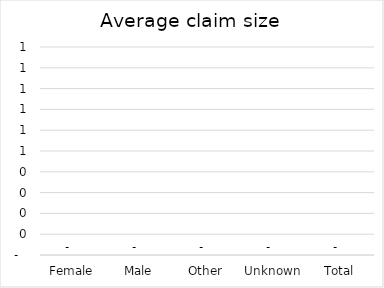
| Category |  Average claim size  |
|---|---|
| Female | 0 |
| Male | 0 |
| Other | 0 |
| Unknown | 0 |
| Total | 0 |